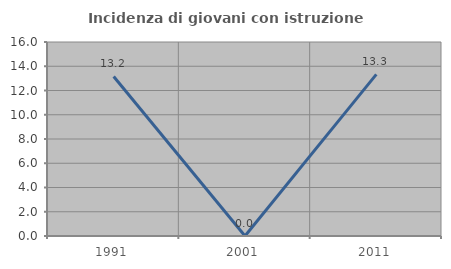
| Category | Incidenza di giovani con istruzione universitaria |
|---|---|
| 1991.0 | 13.158 |
| 2001.0 | 0 |
| 2011.0 | 13.333 |